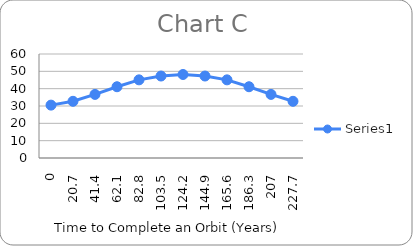
| Category | Series 0 |
|---|---|
| 0.0 | 30.498 |
| 20.7 | 32.708 |
| 41.4 | 36.686 |
| 62.099999999999994 | 41.106 |
| 82.8 | 45.084 |
| 103.5 | 47.294 |
| 124.19999999999999 | 48.178 |
| 144.9 | 47.294 |
| 165.6 | 45.084 |
| 186.29999999999998 | 41.106 |
| 207.0 | 36.686 |
| 227.7 | 32.708 |